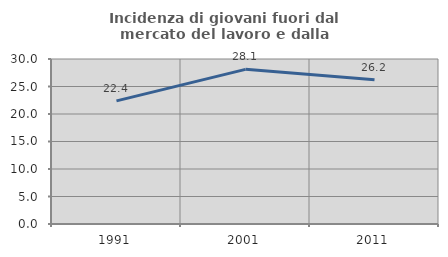
| Category | Incidenza di giovani fuori dal mercato del lavoro e dalla formazione  |
|---|---|
| 1991.0 | 22.391 |
| 2001.0 | 28.116 |
| 2011.0 | 26.21 |